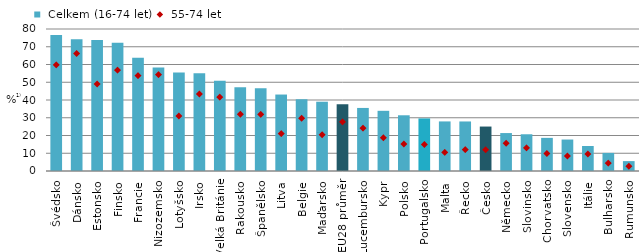
| Category |  Celkem (16-74 let) |
|---|---|
| Švédsko | 76.587 |
| Dánsko | 74.222 |
| Estonsko | 73.849 |
| Finsko | 72.234 |
| Francie | 63.742 |
| Nizozemsko | 58.319 |
| Lotyšsko | 55.538 |
| Irsko | 55.118 |
| Velká Británie | 50.897 |
| Rakousko | 47.113 |
| Španělsko | 46.605 |
| Litva | 43.08 |
| Belgie | 40.472 |
| Maďarsko | 39.028 |
| EU28 průměr | 37.647 |
| Lucembursko | 35.527 |
| Kypr | 33.905 |
| Polsko | 31.392 |
| Portugalsko | 29.617 |
| Malta | 27.931 |
| Řecko | 27.908 |
| Česko | 25.043 |
| Německo | 21.371 |
| Slovinsko | 20.697 |
| Chorvatsko | 18.665 |
| Slovensko | 17.727 |
| Itálie | 14.095 |
| Bulharsko | 10.187 |
| Rumunsko | 5.574 |